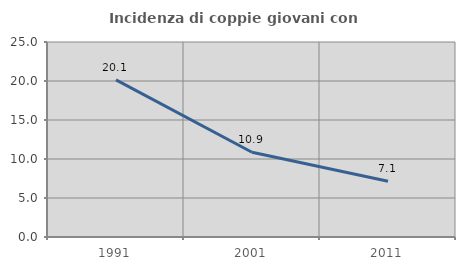
| Category | Incidenza di coppie giovani con figli |
|---|---|
| 1991.0 | 20.135 |
| 2001.0 | 10.868 |
| 2011.0 | 7.143 |